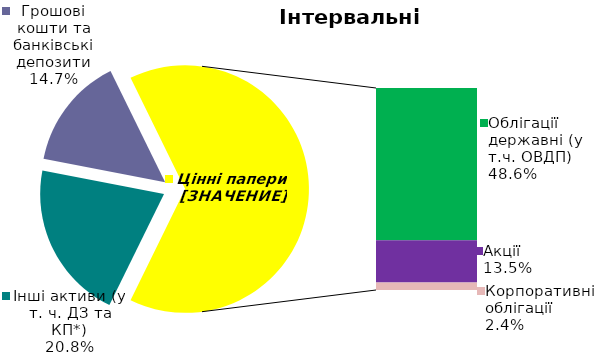
| Category | Series 0 |
|---|---|
| Інші активи (у т. ч. ДЗ та КП*) | 0.208 |
| Грошові кошти та банківські депозити | 0.147 |
| Банківські метали | 0 |
| Облігації державні (у т.ч. ОВДП) | 0.486 |
| Облігації місцевих позик | 0 |
| Акції | 0.135 |
| Корпоративні облігації | 0.024 |